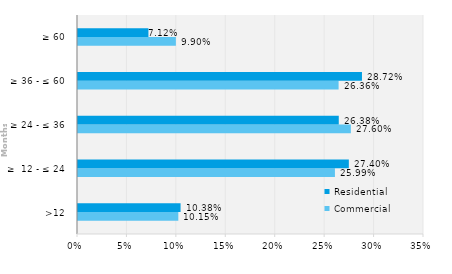
| Category | Commercial | Residential |
|---|---|---|
| >12 | 0.101 | 0.104 |
| ≥  12 - ≤ 24 | 0.26 | 0.274 |
| ≥ 24 - ≤ 36 | 0.276 | 0.264 |
| ≥ 36 - ≤ 60 | 0.264 | 0.287 |
| ≥ 60 | 0.099 | 0.071 |